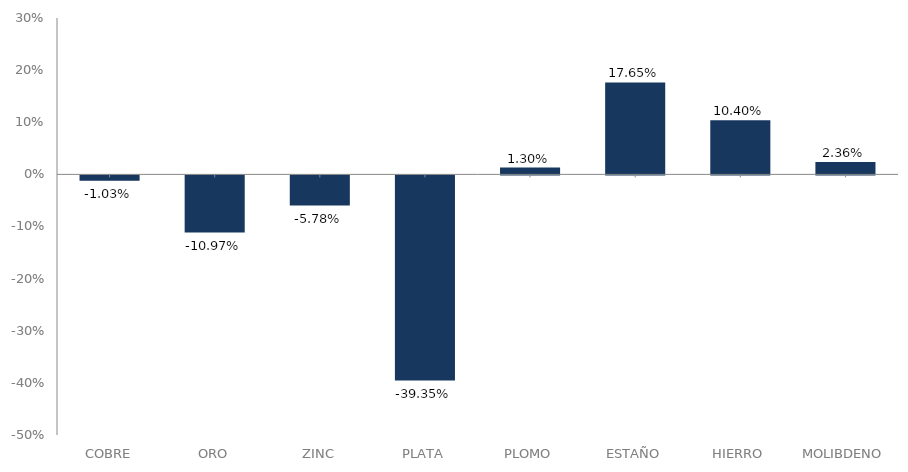
| Category | serie |
|---|---|
| 0 | -0.01 |
| 1 | -0.11 |
| 2 | -0.058 |
| 3 | -0.394 |
| 4 | 0.013 |
| 5 | 0.176 |
| 6 | 0.104 |
| 7 | 0.024 |